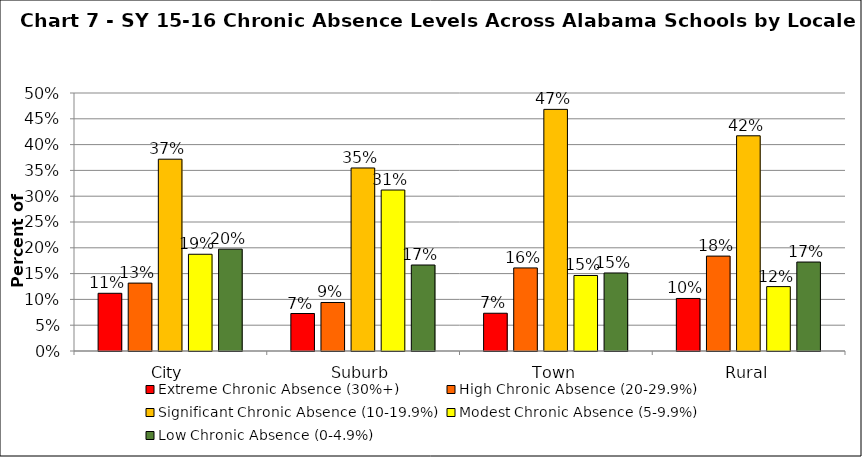
| Category | Extreme Chronic Absence (30%+) | High Chronic Absence (20-29.9%) | Significant Chronic Absence (10-19.9%) | Modest Chronic Absence (5-9.9%) | Low Chronic Absence (0-4.9%) |
|---|---|---|---|---|---|
| 0 | 0.112 | 0.132 | 0.372 | 0.188 | 0.197 |
| 1 | 0.073 | 0.094 | 0.355 | 0.312 | 0.167 |
| 2 | 0.073 | 0.161 | 0.468 | 0.146 | 0.151 |
| 3 | 0.102 | 0.184 | 0.417 | 0.125 | 0.172 |